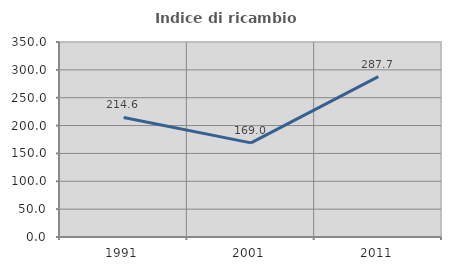
| Category | Indice di ricambio occupazionale  |
|---|---|
| 1991.0 | 214.583 |
| 2001.0 | 168.966 |
| 2011.0 | 287.719 |